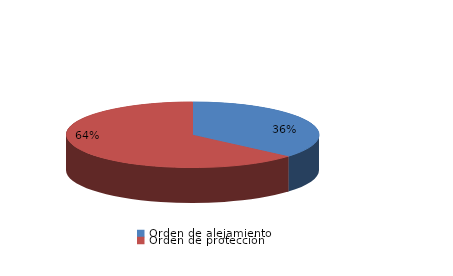
| Category | Series 0 |
|---|---|
| Orden de alejamiento | 73 |
| Orden de protección | 128 |